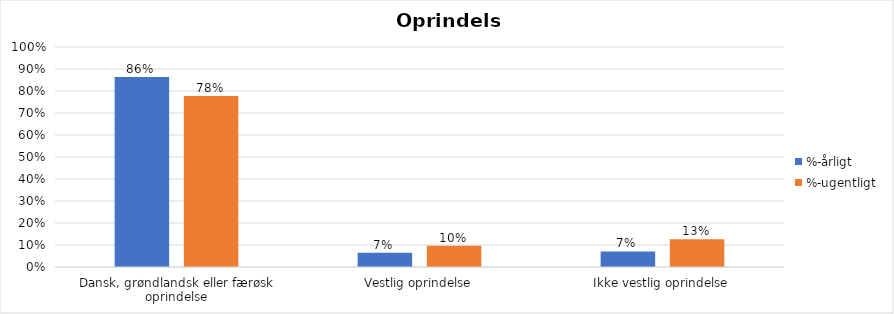
| Category | %-årligt | %-ugentligt |
|---|---|---|
| Dansk, grøndlandsk eller færøsk oprindelse | 0.864 | 0.778 |
| Vestlig oprindelse | 0.065 | 0.096 |
| Ikke vestlig oprindelse | 0.071 | 0.126 |